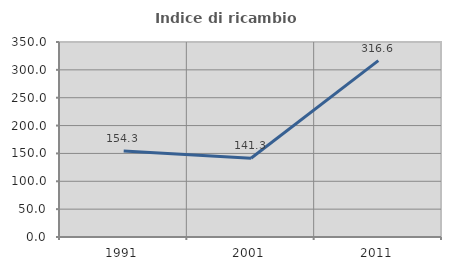
| Category | Indice di ricambio occupazionale  |
|---|---|
| 1991.0 | 154.286 |
| 2001.0 | 141.25 |
| 2011.0 | 316.598 |